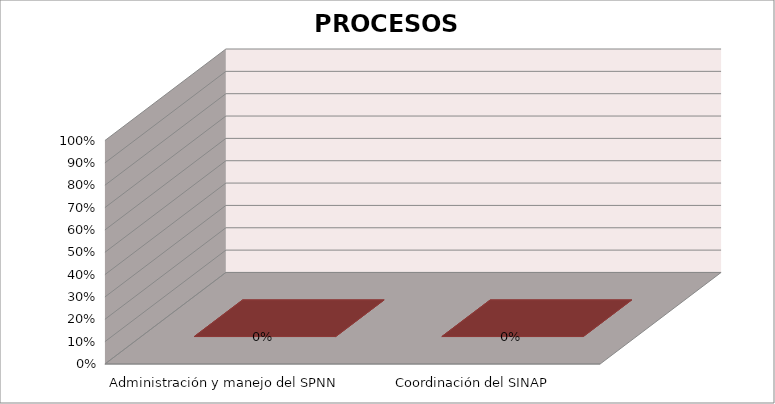
| Category | Series 0 |
|---|---|
| Administración y manejo del SPNN  | 0 |
| Coordinación del SINAP  | 0 |